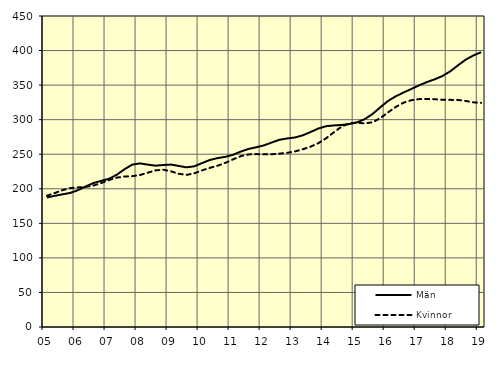
| Category | Män | Kvinnor |
|---|---|---|
| 5.0 | 187.44 | 189.96 |
| nan | 189.8 | 193.78 |
| 6.0 | 191.93 | 197.94 |
| 6.0 | 193.99 | 200.99 |
| 6.0 | 197.91 | 201.97 |
| nan | 203.35 | 202.65 |
| 7.0 | 208.26 | 204.65 |
| 7.0 | 211.43 | 208.2 |
| 7.0 | 214.5 | 212.61 |
| nan | 220.17 | 216.07 |
| 8.0 | 228.17 | 217.74 |
| 8.0 | 234.93 | 218.26 |
| 8.0 | 236.77 | 219.95 |
| nan | 234.96 | 223.2 |
| 9.0 | 233.43 | 226.6 |
| 9.0 | 234.38 | 227.59 |
| 9.0 | 235.03 | 225.3 |
| nan | 233.06 | 221.73 |
| 10.0 | 231.04 | 220.09 |
| 10.0 | 232.46 | 222.34 |
| 10.0 | 237.11 | 226.58 |
| nan | 241.59 | 230.2 |
| 11.0 | 244.36 | 233.32 |
| 11.0 | 246.19 | 237.37 |
| 11.0 | 249.13 | 242.52 |
| nan | 253.8 | 247.17 |
| 12.0 | 257.64 | 249.68 |
| 12.0 | 260.06 | 250.18 |
| 12.0 | 262.86 | 249.84 |
| nan | 266.95 | 249.96 |
| 13.0 | 270.91 | 250.86 |
| 13.0 | 272.83 | 252.03 |
| 13.0 | 274.21 | 254.07 |
| nan | 277.3 | 257.15 |
| 14.0 | 282.08 | 260.86 |
| 14.0 | 287.18 | 265.95 |
| 14.0 | 290.52 | 272.92 |
| nan | 291.66 | 281.66 |
| 15.0 | 292.32 | 289.89 |
| 15.0 | 293.66 | 294.77 |
| 15.0 | 296.15 | 295.59 |
| nan | 300.81 | 294.63 |
| 16.0 | 308.23 | 296.23 |
| 16.0 | 317.93 | 302.23 |
| 16.0 | 327.11 | 310.53 |
| nan | 333.87 | 318.45 |
| 17.0 | 339.34 | 324.6 |
| 17.0 | 344.44 | 328.16 |
| 17.0 | 349.65 | 329.72 |
| nan | 354.39 | 329.95 |
| 18.0 | 358.33 | 329.54 |
| 18.0 | 363.09 | 328.84 |
| 18.0 | 369.76 | 328.65 |
| nan | 378.47 | 328.53 |
| 19.0 | 386.76 | 327.12 |
| 19.0 | 392.89 | 325.05 |
| 19.0 | 397.6 | 324.31 |